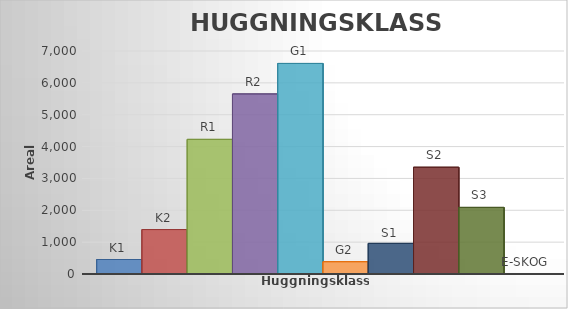
| Category | Series 0 | Series 1 | Series 2 | Series 3 | Series 4 | Series 5 | Series 6 | Series 7 | Series 8 | Series 9 |
|---|---|---|---|---|---|---|---|---|---|---|
| 0 | 455 | 1395 | 4225 | 5650 | 6609 | 385 | 960 | 3350 | 2090 | 0 |